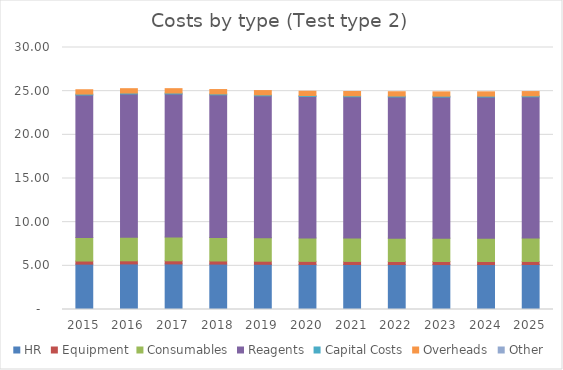
| Category | HR | Equipment | Consumables | Reagents | Capital Costs | Overheads | Other |
|---|---|---|---|---|---|---|---|
| 2015.0 | 5.195 | 0.355 | 2.697 | 16.312 | 0.106 | 0.498 | 0 |
| 2016.0 | 5.22 | 0.356 | 2.71 | 16.391 | 0.106 | 0.5 | 0 |
| 2017.0 | 5.22 | 0.356 | 2.71 | 16.393 | 0.106 | 0.501 | 0 |
| 2018.0 | 5.199 | 0.355 | 2.7 | 16.327 | 0.106 | 0.499 | 0 |
| 2019.0 | 5.175 | 0.353 | 2.687 | 16.252 | 0.106 | 0.496 | 0 |
| 2020.0 | 5.159 | 0.352 | 2.679 | 16.201 | 0.105 | 0.495 | 0 |
| 2021.0 | 5.153 | 0.352 | 2.675 | 16.181 | 0.105 | 0.494 | 0 |
| 2022.0 | 5.148 | 0.351 | 2.673 | 16.165 | 0.105 | 0.494 | 0 |
| 2023.0 | 5.144 | 0.351 | 2.671 | 16.154 | 0.105 | 0.493 | 0 |
| 2024.0 | 5.145 | 0.351 | 2.672 | 16.157 | 0.105 | 0.493 | 0 |
| 2025.0 | 5.152 | 0.352 | 2.675 | 16.177 | 0.105 | 0.494 | 0 |